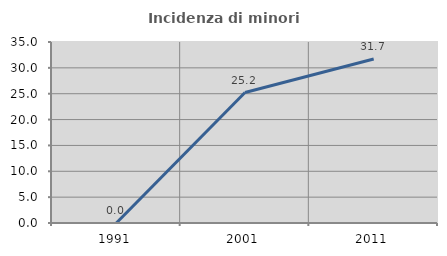
| Category | Incidenza di minori stranieri |
|---|---|
| 1991.0 | 0 |
| 2001.0 | 25.234 |
| 2011.0 | 31.702 |